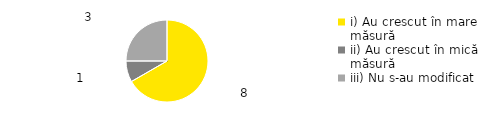
| Category | Total |
|---|---|
| i) Au crescut în mare măsură | 0.667 |
| ii) Au crescut în mică măsură | 0.083 |
| iii) Nu s-au modificat | 0.25 |